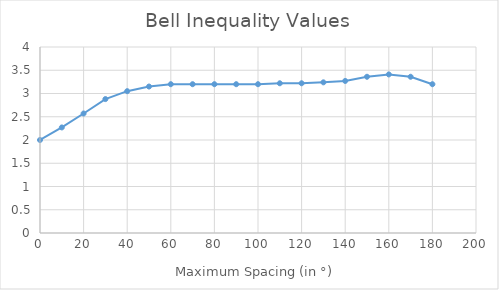
| Category | Bell Inequality Values |
|---|---|
| 0.0 | 2 |
| 10.0 | 2.27 |
| 20.0 | 2.57 |
| 30.0 | 2.88 |
| 40.0 | 3.05 |
| 50.0 | 3.15 |
| 60.0 | 3.2 |
| 70.0 | 3.2 |
| 80.0 | 3.2 |
| 90.0 | 3.2 |
| 100.0 | 3.2 |
| 110.0 | 3.22 |
| 120.0 | 3.22 |
| 130.0 | 3.24 |
| 140.0 | 3.27 |
| 150.0 | 3.36 |
| 160.0 | 3.41 |
| 170.0 | 3.36 |
| 180.0 | 3.2 |